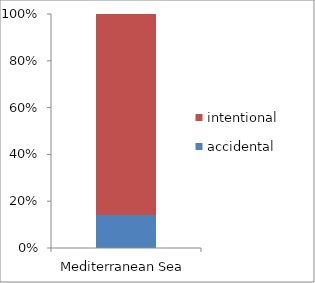
| Category | accidental | intentional |
|---|---|---|
| Mediterranean Sea | 15870 | 97038.75 |